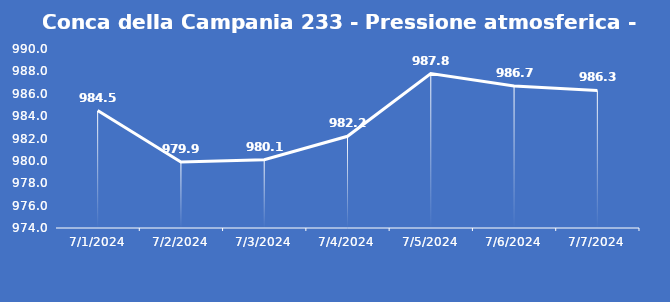
| Category | Conca della Campania 233 - Pressione atmosferica - Grezzo (hPa) |
|---|---|
| 7/1/24 | 984.5 |
| 7/2/24 | 979.9 |
| 7/3/24 | 980.1 |
| 7/4/24 | 982.2 |
| 7/5/24 | 987.8 |
| 7/6/24 | 986.7 |
| 7/7/24 | 986.3 |